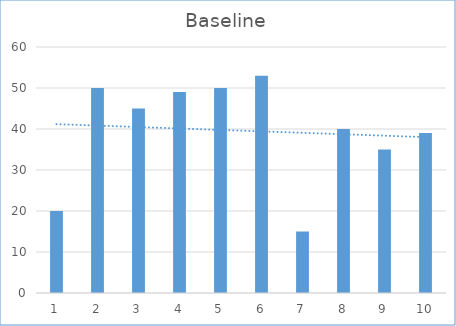
| Category | Series 0 |
|---|---|
| 0 | 20 |
| 1 | 50 |
| 2 | 45 |
| 3 | 49 |
| 4 | 50 |
| 5 | 53 |
| 6 | 15 |
| 7 | 40 |
| 8 | 35 |
| 9 | 39 |